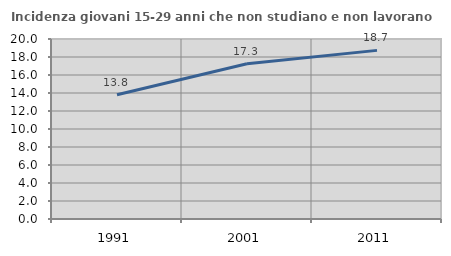
| Category | Incidenza giovani 15-29 anni che non studiano e non lavorano  |
|---|---|
| 1991.0 | 13.805 |
| 2001.0 | 17.259 |
| 2011.0 | 18.737 |